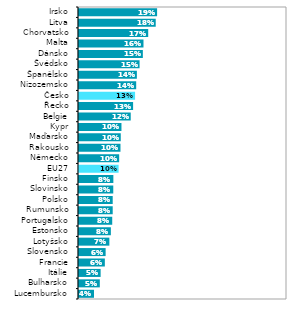
| Category | Series 1 |
|---|---|
| Lucembursko | 0.036 |
| Bulharsko | 0.05 |
| Itálie | 0.052 |
| Francie | 0.062 |
| Slovensko | 0.064 |
| Lotyšsko | 0.073 |
| Estonsko | 0.077 |
| Portugalsko | 0.08 |
| Rumunsko | 0.081 |
| Polsko | 0.081 |
| Slovinsko | 0.082 |
| Finsko | 0.083 |
| EU27 | 0.095 |
| Německo | 0.097 |
| Rakousko | 0.1 |
| Maďarsko | 0.1 |
| Kypr | 0.102 |
| Belgie | 0.124 |
| Řecko | 0.13 |
| Česko | 0.135 |
| Nizozemsko | 0.137 |
| Španělsko | 0.139 |
| Švédsko | 0.146 |
| Dánsko | 0.153 |
| Malta | 0.155 |
| Chorvatsko | 0.166 |
| Litva | 0.184 |
| Irsko | 0.188 |